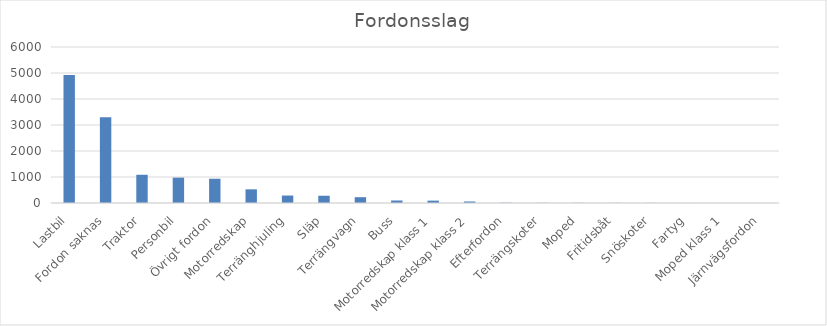
| Category | Summa |
|---|---|
| Lastbil | 4924 |
| Fordon saknas | 3297 |
| Traktor | 1086 |
| Personbil | 975 |
| Övrigt fordon | 933 |
| Motorredskap | 526 |
| Terränghjuling | 287 |
| Släp | 279 |
| Terrängvagn | 223 |
| Buss | 96 |
| Motorredskap klass 1 | 91 |
| Motorredskap klass 2 | 58 |
| Efterfordon | 11 |
| Terrängskoter | 6 |
| Moped | 6 |
| Fritidsbåt | 5 |
| Snöskoter | 5 |
| Fartyg | 2 |
| Moped klass 1 | 1 |
| Järnvägsfordon | 1 |